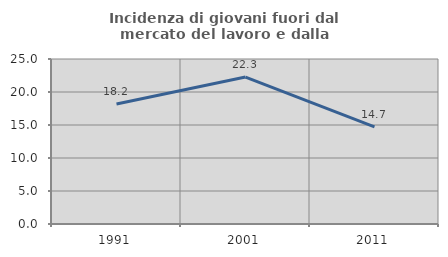
| Category | Incidenza di giovani fuori dal mercato del lavoro e dalla formazione  |
|---|---|
| 1991.0 | 18.182 |
| 2001.0 | 22.269 |
| 2011.0 | 14.706 |